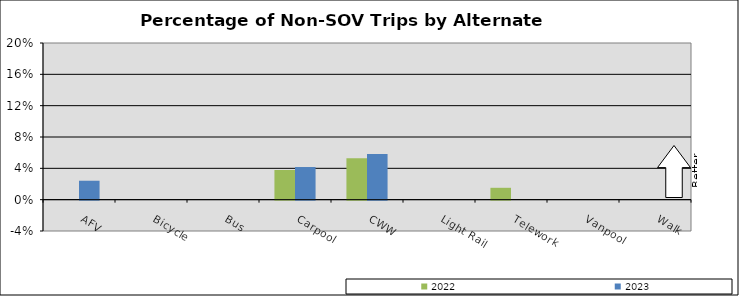
| Category | 2022 | 2023 |
|---|---|---|
| AFV | 0 | 0.024 |
| Bicycle | 0 | 0 |
| Bus | 0 | 0 |
| Carpool | 0.038 | 0.042 |
| CWW | 0.053 | 0.058 |
| Light Rail | 0 | 0 |
| Telework | 0.015 | 0 |
| Vanpool | 0 | 0 |
| Walk | 0 | 0 |